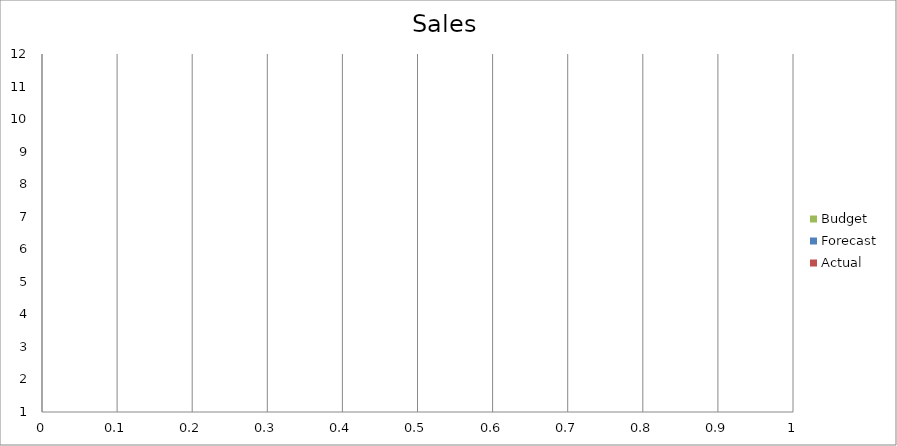
| Category | Budget | Forecast | Actual |
|---|---|---|---|
| 0 | 3500 | 3080 | 840 |
| 1 | 2350 | 3460 | 1430 |
| 2 | 3110 | 960 | 3060 |
| 3 | 3480 | 2420 | 1680 |
| 4 | 1220 | 2400 | 850 |
| 5 | 2520 | 1880 | 2820 |
| 6 | 2350 | 3470 | 2680 |
| 7 | 2810 | 550 | 2540 |
| 8 | 3030 | 2680 | 1470 |
| 9 | 1950 | 2980 | 2980 |
| 10 | 670 | 2940 | 1090 |
| 11 | 2100 | 3480 | 2060 |